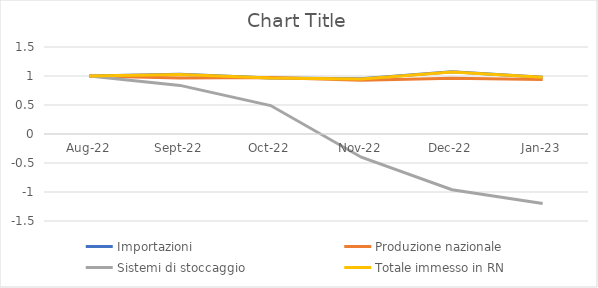
| Category | Importazioni | Produzione nazionale | Sistemi di stoccaggio | Totale immesso in RN |
|---|---|---|---|---|
| 2022-08-01 | 1 | 1 | 1 | 1 |
| 2022-09-01 | 1.028 | 0.967 | 0.838 | 1.025 |
| 2022-10-01 | 0.967 | 0.976 | 0.49 | 0.967 |
| 2022-11-01 | 0.951 | 0.928 | -0.4 | 0.95 |
| 2022-12-01 | 1.073 | 0.961 | -0.96 | 1.068 |
| 2023-01-01 | 0.979 | 0.939 | -1.2 | 0.977 |